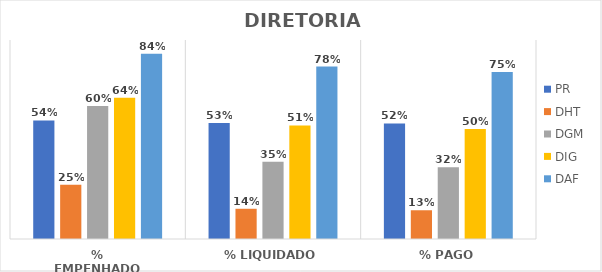
| Category | PR | DHT | DGM | DIG | DAF |
|---|---|---|---|---|---|
| % EMPENHADO | 0.536 | 0.246 | 0.601 | 0.639 | 0.837 |
| % LIQUIDADO | 0.525 | 0.137 | 0.349 | 0.514 | 0.78 |
| % PAGO | 0.523 | 0.13 | 0.325 | 0.498 | 0.755 |